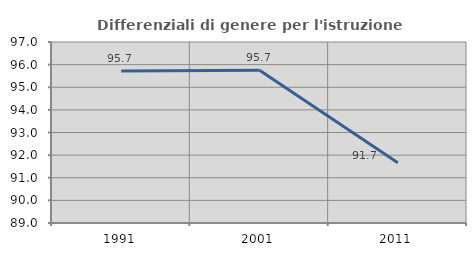
| Category | Differenziali di genere per l'istruzione superiore |
|---|---|
| 1991.0 | 95.719 |
| 2001.0 | 95.748 |
| 2011.0 | 91.659 |